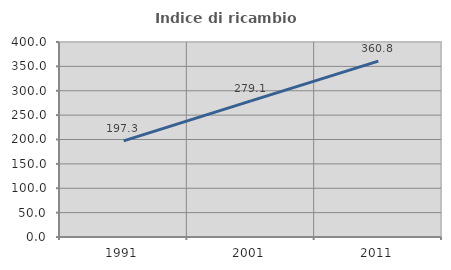
| Category | Indice di ricambio occupazionale  |
|---|---|
| 1991.0 | 197.297 |
| 2001.0 | 279.104 |
| 2011.0 | 360.784 |